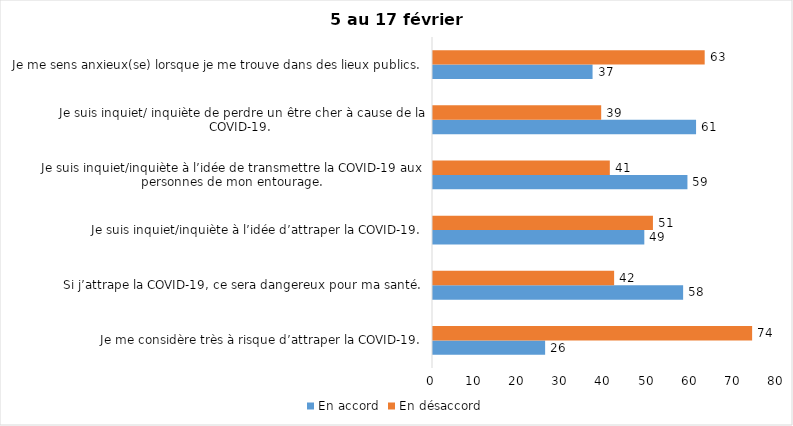
| Category | En accord | En désaccord |
|---|---|---|
| Je me considère très à risque d’attraper la COVID-19. | 26 | 74 |
| Si j’attrape la COVID-19, ce sera dangereux pour ma santé. | 58 | 42 |
| Je suis inquiet/inquiète à l’idée d’attraper la COVID-19. | 49 | 51 |
| Je suis inquiet/inquiète à l’idée de transmettre la COVID-19 aux personnes de mon entourage. | 59 | 41 |
| Je suis inquiet/ inquiète de perdre un être cher à cause de la COVID-19. | 61 | 39 |
| Je me sens anxieux(se) lorsque je me trouve dans des lieux publics. | 37 | 63 |